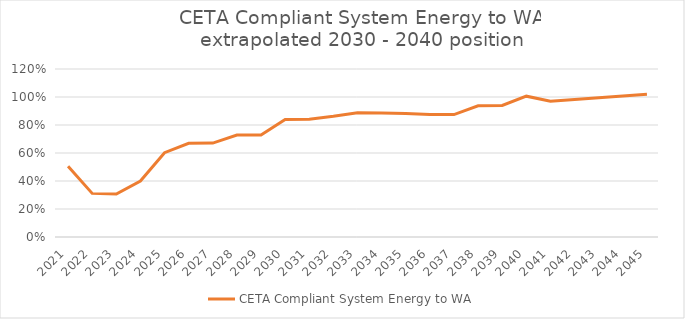
| Category | CETA Compliant System Energy to WA |
|---|---|
| 2021.0 | 0.505 |
| 2022.0 | 0.312 |
| 2023.0 | 0.307 |
| 2024.0 | 0.4 |
| 2025.0 | 0.602 |
| 2026.0 | 0.669 |
| 2027.0 | 0.671 |
| 2028.0 | 0.728 |
| 2029.0 | 0.729 |
| 2030.0 | 0.84 |
| 2031.0 | 0.841 |
| 2032.0 | 0.862 |
| 2033.0 | 0.888 |
| 2034.0 | 0.885 |
| 2035.0 | 0.883 |
| 2036.0 | 0.875 |
| 2037.0 | 0.875 |
| 2038.0 | 0.937 |
| 2039.0 | 0.94 |
| 2040.0 | 1.006 |
| 2041.0 | 0.97 |
| 2042.0 | 0.983 |
| 2043.0 | 0.995 |
| 2044.0 | 1.008 |
| 2045.0 | 1.02 |